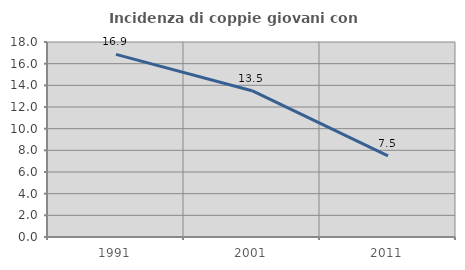
| Category | Incidenza di coppie giovani con figli |
|---|---|
| 1991.0 | 16.86 |
| 2001.0 | 13.505 |
| 2011.0 | 7.48 |